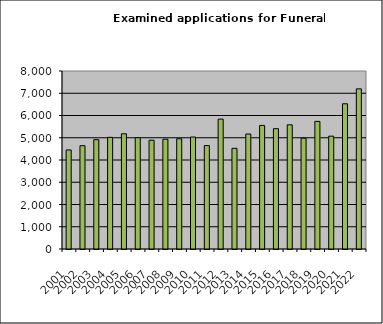
| Category | Series 0 |
|---|---|
| 2001.0 | 4451 |
| 2002.0 | 4643 |
| 2003.0 | 4914 |
| 2004.0 | 5018 |
| 2005.0 | 5179 |
| 2006.0 | 5002 |
| 2007.0 | 4888 |
| 2008.0 | 4935 |
| 2009.0 | 4955 |
| 2010.0 | 5033 |
| 2011.0 | 4648 |
| 2012.0 | 5838 |
| 2013.0 | 4525 |
| 2014.0 | 5168 |
| 2015.0 | 5554 |
| 2016.0 | 5408 |
| 2017.0 | 5581 |
| 2018.0 | 4980 |
| 2019.0 | 5735 |
| 2020.0 | 5071 |
| 2021.0 | 6527 |
| 2022.0 | 7197 |